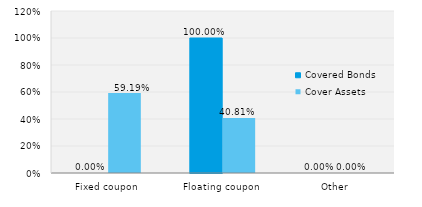
| Category | Covered Bonds | Cover Assets |
|---|---|---|
| Fixed coupon | 0 | 0.592 |
| Floating coupon | 1 | 0.408 |
| Other | 0 | 0 |